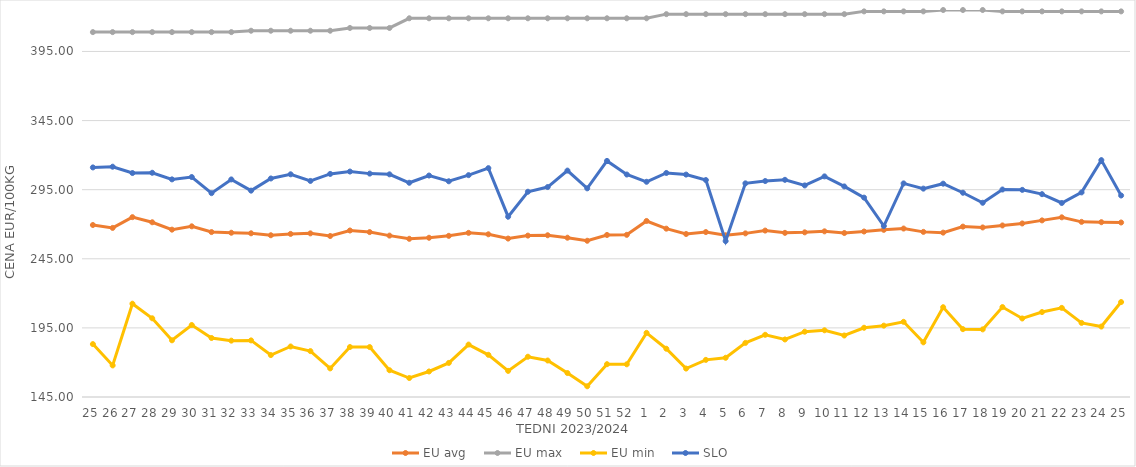
| Category | EU avg | EU max | EU min | SLO |
|---|---|---|---|---|
| 25.0 | 269.439 | 409 | 183.275 | 311.1 |
| 26.0 | 267.345 | 409 | 167.858 | 311.62 |
| 27.0 | 275.123 | 409 | 212.506 | 307.04 |
| 28.0 | 271.42 | 409 | 201.945 | 307.23 |
| 29.0 | 266.08 | 409 | 186.018 | 302.45 |
| 30.0 | 268.49 | 409 | 197.093 | 304.14 |
| 31.0 | 264.334 | 409 | 187.684 | 292.49 |
| 32.0 | 263.844 | 409 | 185.774 | 302.41 |
| 33.0 | 263.441 | 410 | 185.951 | 294.3 |
| 34.0 | 262.028 | 410 | 175.332 | 303.1 |
| 35.0 | 262.997 | 410 | 181.543 | 306.13 |
| 36.0 | 263.389 | 410 | 178.207 | 301.32 |
| 37.0 | 261.486 | 410 | 165.697 | 306.4 |
| 38.0 | 265.47 | 412 | 181.159 | 308.12 |
| 39.0 | 264.316 | 412 | 181.124 | 306.62 |
| 40.0 | 261.774 | 412 | 164.37 | 306.1 |
| 41.0 | 259.456 | 419 | 158.728 | 300 |
| 42.0 | 260.21 | 419 | 163.464 | 305.24 |
| 43.0 | 261.605 | 419 | 169.66 | 301.07 |
| 44.0 | 263.758 | 419 | 182.925 | 305.52 |
| 45.0 | 262.714 | 419 | 175.524 | 310.58 |
| 46.0 | 259.625 | 419 | 163.882 | 275.46 |
| 47.0 | 261.772 | 419 | 174.136 | 293.51 |
| 48.0 | 262.018 | 419 | 171.4 | 296.9 |
| 49.0 | 260.246 | 419 | 162.336 | 308.8 |
| 50.0 | 258.042 | 419 | 152.762 | 295.97 |
| 51.0 | 262.231 | 419 | 168.739 | 315.82 |
| 52.0 | 262.325 | 419 | 168.659 | 305.97 |
| 1.0 | 272.352 | 419 | 191.406 | 300.71 |
| 2.0 | 266.798 | 422 | 179.926 | 307.09 |
| 3.0 | 262.938 | 422 | 165.575 | 305.92 |
| 4.0 | 264.34 | 422 | 171.865 | 301.97 |
| 5.0 | 262.015 | 422 | 173.378 | 257.83 |
| 6.0 | 263.39 | 422 | 184.141 | 299.57 |
| 7.0 | 265.419 | 422 | 190.004 | 301.25 |
| 8.0 | 263.762 | 422 | 186.634 | 302.13 |
| 9.0 | 264.137 | 422 | 192.243 | 298.07 |
| 10.0 | 264.859 | 422 | 193.276 | 304.62 |
| 11.0 | 263.652 | 422 | 189.495 | 297.35 |
| 12.0 | 264.728 | 424 | 195.103 | 289.25 |
| 13.0 | 265.942 | 424 | 196.623 | 268.71 |
| 14.0 | 266.881 | 424 | 199.39 | 299.54 |
| 15.0 | 264.469 | 424 | 184.549 | 295.76 |
| 16.0 | 263.92 | 425 | 209.956 | 299.34 |
| 17.0 | 268.274 | 425 | 194.091 | 292.78 |
| 18.0 | 267.67 | 425 | 193.924 | 285.52 |
| 19.0 | 269.114 | 424 | 210.073 | 295.12 |
| 20.0 | 270.554 | 424 | 201.817 | 294.86 |
| 21.0 | 272.784 | 424 | 206.456 | 291.76 |
| 22.0 | 275.002 | 424 | 209.481 | 285.37 |
| 23.0 | 271.708 | 424 | 198.618 | 293.03 |
| 24.0 | 271.467 | 424 | 195.961 | 316.37 |
| 25.0 | 271.254 | 424 | 213.708 | 290.79 |